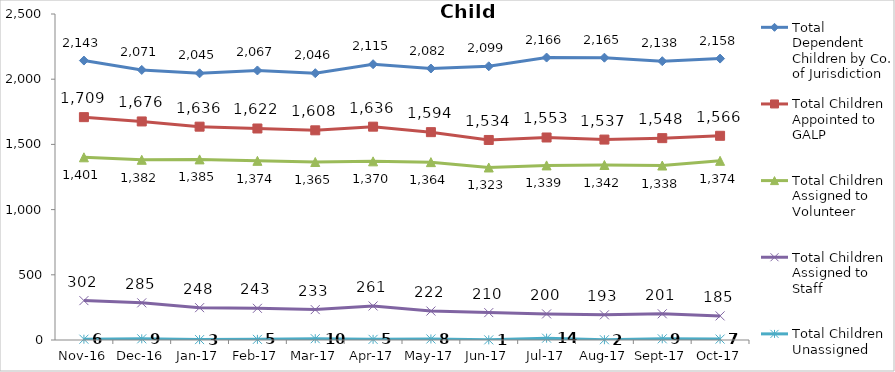
| Category | Total Dependent Children by Co. of Jurisdiction | Total Children Appointed to GALP | Total Children Assigned to Volunteer | Total Children Assigned to Staff | Total Children Unassigned |
|---|---|---|---|---|---|
| 2016-11-01 | 2143 | 1709 | 1401 | 302 | 6 |
| 2016-12-01 | 2071 | 1676 | 1382 | 285 | 9 |
| 2017-01-01 | 2045 | 1636 | 1385 | 248 | 3 |
| 2017-02-01 | 2067 | 1622 | 1374 | 243 | 5 |
| 2017-03-01 | 2046 | 1608 | 1365 | 233 | 10 |
| 2017-04-01 | 2115 | 1636 | 1370 | 261 | 5 |
| 2017-05-01 | 2082 | 1594 | 1364 | 222 | 8 |
| 2017-06-01 | 2099 | 1534 | 1323 | 210 | 1 |
| 2017-07-01 | 2166 | 1553 | 1339 | 200 | 14 |
| 2017-08-01 | 2165 | 1537 | 1342 | 193 | 2 |
| 2017-09-01 | 2138 | 1548 | 1338 | 201 | 9 |
| 2017-10-01 | 2158 | 1566 | 1374 | 185 | 7 |